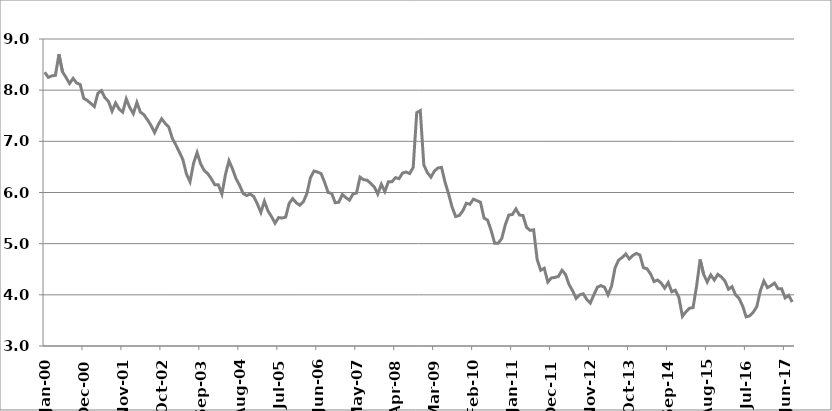
| Category | Series 1 |
|---|---|
| 2000-01-01 | 8.35 |
| 2000-02-01 | 8.25 |
| 2000-03-01 | 8.28 |
| 2000-04-01 | 8.29 |
| 2000-05-01 | 8.7 |
| 2000-06-01 | 8.36 |
| 2000-07-01 | 8.25 |
| 2000-08-01 | 8.13 |
| 2000-09-01 | 8.23 |
| 2000-10-01 | 8.14 |
| 2000-11-01 | 8.11 |
| 2000-12-01 | 7.84 |
| 2001-01-01 | 7.8 |
| 2001-02-01 | 7.74 |
| 2001-03-01 | 7.68 |
| 2001-04-01 | 7.94 |
| 2001-05-01 | 7.99 |
| 2001-06-01 | 7.85 |
| 2001-07-01 | 7.78 |
| 2001-08-01 | 7.59 |
| 2001-09-01 | 7.75 |
| 2001-10-01 | 7.63 |
| 2001-11-01 | 7.57 |
| 2001-12-01 | 7.83 |
| 2002-01-01 | 7.66 |
| 2002-02-01 | 7.54 |
| 2002-03-01 | 7.76 |
| 2002-04-01 | 7.57 |
| 2002-05-01 | 7.52 |
| 2002-06-01 | 7.42 |
| 2002-07-01 | 7.31 |
| 2002-08-01 | 7.17 |
| 2002-09-01 | 7.32 |
| 2002-10-01 | 7.44 |
| 2002-11-01 | 7.35 |
| 2002-12-01 | 7.28 |
| 2003-01-01 | 7.06 |
| 2003-02-01 | 6.93 |
| 2003-03-01 | 6.79 |
| 2003-04-01 | 6.64 |
| 2003-05-01 | 6.36 |
| 2003-06-01 | 6.21 |
| 2003-07-01 | 6.57 |
| 2003-08-01 | 6.78 |
| 2003-09-01 | 6.56 |
| 2003-10-01 | 6.43 |
| 2003-11-01 | 6.37 |
| 2003-12-01 | 6.27 |
| 2004-01-01 | 6.15 |
| 2004-02-01 | 6.15 |
| 2004-03-01 | 5.97 |
| 2004-04-01 | 6.35 |
| 2004-05-01 | 6.62 |
| 2004-06-01 | 6.46 |
| 2004-07-01 | 6.27 |
| 2004-08-01 | 6.14 |
| 2004-09-01 | 5.98 |
| 2004-10-01 | 5.94 |
| 2004-11-01 | 5.97 |
| 2004-12-01 | 5.92 |
| 2005-01-01 | 5.78 |
| 2005-02-01 | 5.61 |
| 2005-03-01 | 5.83 |
| 2005-04-01 | 5.64 |
| 2005-05-01 | 5.53 |
| 2005-06-01 | 5.4 |
| 2005-07-01 | 5.51 |
| 2005-08-01 | 5.5 |
| 2005-09-01 | 5.52 |
| 2005-10-01 | 5.79 |
| 2005-11-01 | 5.88 |
| 2005-12-01 | 5.8 |
| 2006-01-01 | 5.75 |
| 2006-02-01 | 5.82 |
| 2006-03-01 | 5.98 |
| 2006-04-01 | 6.29 |
| 2006-05-01 | 6.42 |
| 2006-06-01 | 6.4 |
| 2006-07-01 | 6.37 |
| 2006-08-01 | 6.2 |
| 2006-09-01 | 6 |
| 2006-10-01 | 5.98 |
| 2006-11-01 | 5.8 |
| 2006-12-01 | 5.81 |
| 2007-01-01 | 5.96 |
| 2007-02-01 | 5.9 |
| 2007-03-01 | 5.85 |
| 2007-04-01 | 5.97 |
| 2007-05-01 | 5.99 |
| 2007-06-01 | 6.3 |
| 2007-07-01 | 6.25 |
| 2007-08-01 | 6.24 |
| 2007-09-01 | 6.18 |
| 2007-10-01 | 6.11 |
| 2007-11-01 | 5.97 |
| 2007-12-01 | 6.16 |
| 2008-01-01 | 6.02 |
| 2008-02-01 | 6.21 |
| 2008-03-01 | 6.21 |
| 2008-04-01 | 6.29 |
| 2008-05-01 | 6.27 |
| 2008-06-01 | 6.38 |
| 2008-07-01 | 6.4 |
| 2008-08-01 | 6.37 |
| 2008-09-01 | 6.49 |
| 2008-10-01 | 7.56 |
| 2008-11-01 | 7.6 |
| 2008-12-01 | 6.54 |
| 2009-01-01 | 6.39 |
| 2009-02-01 | 6.3 |
| 2009-03-01 | 6.42 |
| 2009-04-01 | 6.48 |
| 2009-05-01 | 6.49 |
| 2009-06-01 | 6.2 |
| 2009-07-01 | 5.97 |
| 2009-08-01 | 5.71 |
| 2009-09-01 | 5.53 |
| 2009-10-01 | 5.55 |
| 2009-11-01 | 5.64 |
| 2009-12-01 | 5.79 |
| 2010-01-01 | 5.77 |
| 2010-02-01 | 5.87 |
| 2010-03-01 | 5.84 |
| 2010-04-01 | 5.81 |
| 2010-05-01 | 5.5 |
| 2010-06-01 | 5.46 |
| 2010-07-01 | 5.26 |
| 2010-08-01 | 5.01 |
| 2010-09-01 | 5.01 |
| 2010-10-01 | 5.1 |
| 2010-11-01 | 5.37 |
| 2010-12-01 | 5.56 |
| 2011-01-01 | 5.57 |
| 2011-02-01 | 5.68 |
| 2011-03-01 | 5.56 |
| 2011-04-01 | 5.55 |
| 2011-05-01 | 5.32 |
| 2011-06-01 | 5.26 |
| 2011-07-01 | 5.27 |
| 2011-08-01 | 4.69 |
| 2011-09-01 | 4.48 |
| 2011-10-01 | 4.52 |
| 2011-11-01 | 4.25 |
| 2011-12-01 | 4.33 |
| 2012-01-01 | 4.34 |
| 2012-02-01 | 4.36 |
| 2012-03-01 | 4.48 |
| 2012-04-01 | 4.4 |
| 2012-05-01 | 4.2 |
| 2012-06-01 | 4.08 |
| 2012-07-01 | 3.93 |
| 2012-08-01 | 4 |
| 2012-09-01 | 4.02 |
| 2012-10-01 | 3.91 |
| 2012-11-01 | 3.84 |
| 2012-12-01 | 4 |
| 2013-01-01 | 4.15 |
| 2013-02-01 | 4.18 |
| 2013-03-01 | 4.15 |
| 2013-04-01 | 4 |
| 2013-05-01 | 4.17 |
| 2013-06-01 | 4.53 |
| 2013-07-01 | 4.68 |
| 2013-08-01 | 4.73 |
| 2013-09-01 | 4.8 |
| 2013-10-01 | 4.7 |
| 2013-11-01 | 4.77 |
| 2013-12-01 | 4.81 |
| 2014-01-01 | 4.778 |
| 2014-02-01 | 4.53 |
| 2014-03-01 | 4.51 |
| 2014-04-01 | 4.41 |
| 2014-05-01 | 4.26 |
| 2014-06-01 | 4.29 |
| 2014-07-01 | 4.23 |
| 2014-08-01 | 4.13 |
| 2014-09-01 | 4.24 |
| 2014-10-01 | 4.06 |
| 2014-11-01 | 4.09 |
| 2014-12-01 | 3.95 |
| 2015-01-01 | 3.58 |
| 2015-02-01 | 3.67 |
| 2015-03-01 | 3.74 |
| 2015-04-01 | 3.75 |
| 2015-05-01 | 4.17 |
| 2015-06-01 | 4.69 |
| 2015-07-01 | 4.4 |
| 2015-08-01 | 4.25 |
| 2015-09-01 | 4.39 |
| 2015-10-01 | 4.29 |
| 2015-11-01 | 4.4 |
| 2015-12-01 | 4.35 |
| 2016-01-01 | 4.27 |
| 2016-02-01 | 4.11 |
| 2016-03-01 | 4.16 |
| 2016-04-01 | 4 |
| 2016-05-01 | 3.93 |
| 2016-06-01 | 3.78 |
| 2016-07-01 | 3.57 |
| 2016-08-01 | 3.59 |
| 2016-09-01 | 3.66 |
| 2016-10-01 | 3.77 |
| 2016-11-01 | 4.08 |
| 2016-12-01 | 4.27 |
| 2017-01-01 | 4.14 |
| 2017-02-01 | 4.18 |
| 2017-03-01 | 4.23 |
| 2017-04-01 | 4.12 |
| 2017-05-01 | 4.12 |
| 2017-06-01 | 3.94 |
| 2017-07-01 | 3.99 |
| 2017-08-01 | 3.86 |